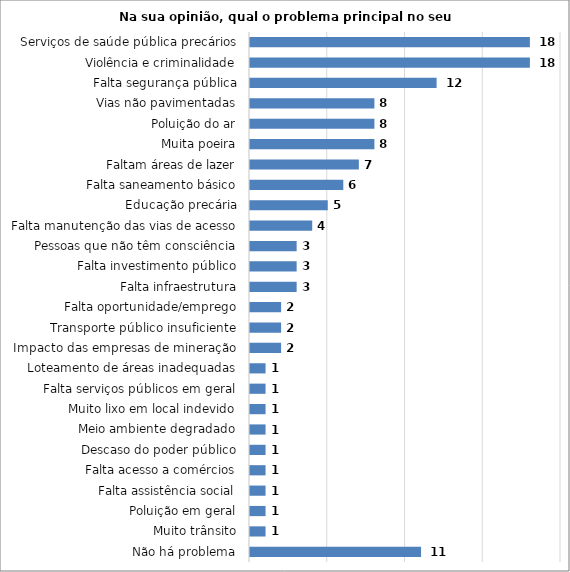
| Category | Series 0 |
|---|---|
| Não há problema | 11 |
| Muito trânsito | 1 |
| Poluição em geral | 1 |
| Falta assistência social | 1 |
| Falta acesso a comércios | 1 |
| Descaso do poder público | 1 |
| Meio ambiente degradado | 1 |
| Muito lixo em local indevido | 1 |
| Falta serviços públicos em geral | 1 |
| Loteamento de áreas inadequadas | 1 |
| Impacto das empresas de mineração | 2 |
| Transporte público insuficiente | 2 |
| Falta oportunidade/emprego | 2 |
| Falta infraestrutura | 3 |
| Falta investimento público | 3 |
| Pessoas que não têm consciência | 3 |
| Falta manutenção das vias de acesso | 4 |
| Educação precária | 5 |
| Falta saneamento básico | 6 |
| Faltam áreas de lazer | 7 |
| Muita poeira | 8 |
| Poluição do ar | 8 |
| Vias não pavimentadas | 8 |
| Falta segurança pública | 12 |
| Violência e criminalidade | 18 |
| Serviços de saúde pública precários | 18 |